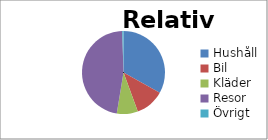
| Category | Relativt |
|---|---|
| Hushåll | 0.331 |
| Bil | 0.113 |
| Kläder | 0.082 |
| Resor | 0.469 |
| Övrigt | 0.005 |